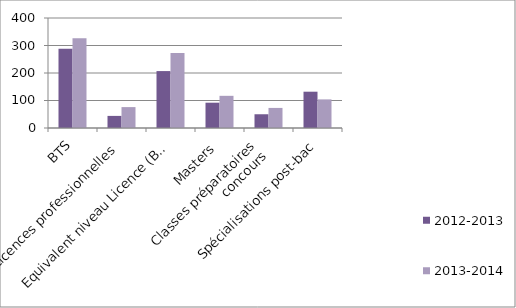
| Category | 2012-2013 | 2013-2014 |
|---|---|---|
| BTS | 288 | 326 |
| Licences professionnelles | 44 | 76 |
| Equivalent niveau Licence (Bac+3) | 207 | 273 |
| Masters | 92 | 117 |
| Classes préparatoires
 concours | 50 | 73 |
| Spécialisations post-bac | 132 | 104 |